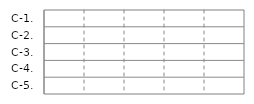
| Category | IN | OUT |
|---|---|---|
| C-1. | 0 | 0 |
| C-2. | 0 | 0 |
| C-3. | 0 | 0 |
| C-4. | 0 | 0 |
| C-5. | 0 | 0 |